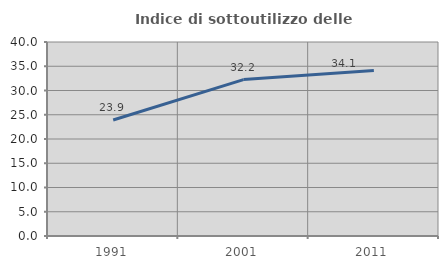
| Category | Indice di sottoutilizzo delle abitazioni  |
|---|---|
| 1991.0 | 23.922 |
| 2001.0 | 32.249 |
| 2011.0 | 34.12 |